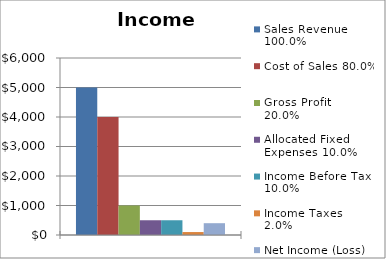
| Category | Sales Revenue 100.0% | Cost of Sales 80.0% | Gross Profit 
20.0% | Allocated Fixed Expenses 10.0% | Income Before Tax 
10.0% | Income Taxes 
2.0% | Net Income (Loss) 
8.0% |
|---|---|---|---|---|---|---|---|
|  | 5000 | 4000 | 1000 | 500 | 500 | 100 | 400 |